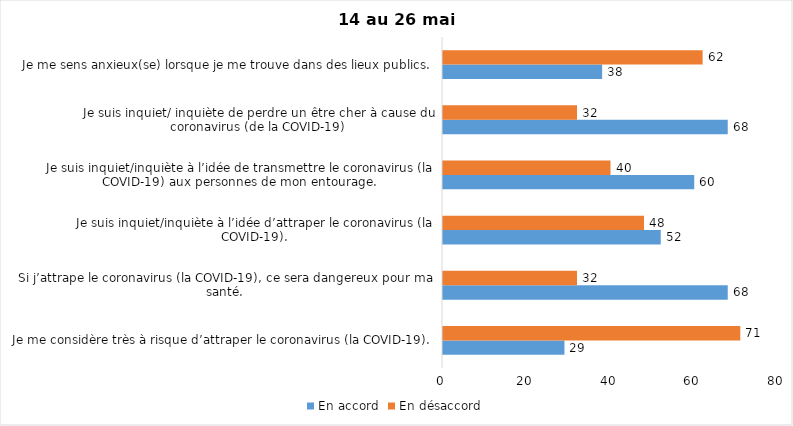
| Category | En accord | En désaccord |
|---|---|---|
| Je me considère très à risque d’attraper le coronavirus (la COVID-19). | 29 | 71 |
| Si j’attrape le coronavirus (la COVID-19), ce sera dangereux pour ma santé. | 68 | 32 |
| Je suis inquiet/inquiète à l’idée d’attraper le coronavirus (la COVID-19). | 52 | 48 |
| Je suis inquiet/inquiète à l’idée de transmettre le coronavirus (la COVID-19) aux personnes de mon entourage. | 60 | 40 |
| Je suis inquiet/ inquiète de perdre un être cher à cause du coronavirus (de la COVID-19) | 68 | 32 |
| Je me sens anxieux(se) lorsque je me trouve dans des lieux publics. | 38 | 62 |